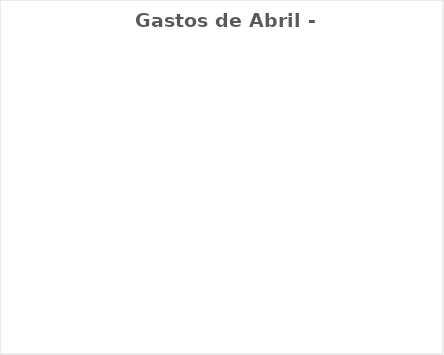
| Category | Gastos de Abril - Real |
|---|---|
| Despesas Mensais | 0 |
| Aposentadoria/Pagar à si | 0 |
| Gratidão/ Doação/ Dizimo | 0 |
| Desejos | 0 |
| Dívidas/Investimentos | 0 |